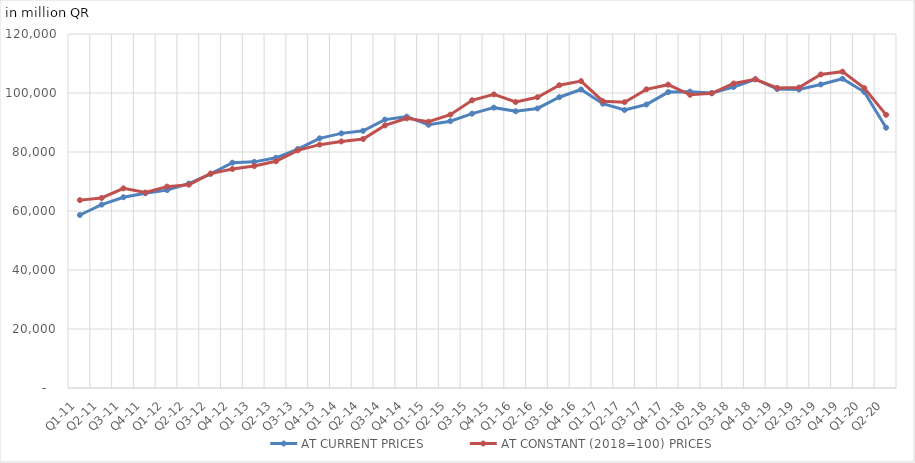
| Category | AT CURRENT PRICES | AT CONSTANT (2018=100) PRICES |
|---|---|---|
| Q1-11 | 58639.011 | 63688.604 |
| Q2-11 | 62155.229 | 64419.436 |
| Q3-11 | 64667.888 | 67676.767 |
| Q4-11 | 66012.84 | 66256.933 |
| Q1-12 | 67081.337 | 68268.355 |
| Q2-12 | 69309.103 | 68929.324 |
| Q3-12 | 72604.594 | 72668.251 |
| Q4-12 | 76382.012 | 74224.95 |
| Q1-13 | 76659.798 | 75244.093 |
| Q2-13 | 78033.447 | 76862.407 |
| Q3-13 | 81008.301 | 80553.324 |
| Q4-13 | 84636.542 | 82494.238 |
| Q1-14 | 86312.629 | 83575.45 |
| Q2-14 | 87187.125 | 84401.327 |
| Q3-14 | 90982.033 | 89014.195 |
| Q4-14 | 91986.042 | 91417.367 |
| Q1-15 | 89218.257 | 90261.278 |
| Q2-15 | 90447.834 | 92659.138 |
| Q3-15 | 92994.679 | 97535.466 |
| Q4-15 | 95031.334 | 99526.196 |
| Q1-16 | 93804.661 | 96941.69 |
| Q2-16 | 94761.924 | 98563.001 |
| Q3-16 | 98570.536 | 102630.836 |
| Q4-16 | 101184.473 | 104024.545 |
| Q1-17 | 96364.032 | 97228.361 |
| Q2-17 | 94231.125 | 96891.689 |
| Q3-17 | 96099.127 | 101241.583 |
| Q4-17 | 100301.33 | 102823.511 |
| Q1-18 | 100451.377 | 99386.58 |
| Q2-18 | 100003.844 | 99886.008 |
| Q3-18 | 102019.033 | 103223.619 |
| Q4-18 | 104667.304 | 104645.351 |
| Q1-19 | 101338.658 | 101717.416 |
| Q2-19 | 101165.651 | 101863.044 |
| Q3-19 | 102900.85 | 106279.847 |
| Q4-19 | 104840.877 | 107241.02 |
| Q1-20 | 100325.459 | 101644.51 |
| Q2-20 | 88229.495 | 92595.325 |